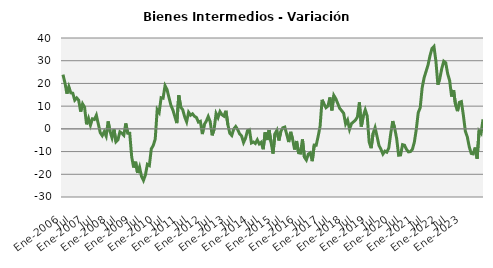
| Category | Series 0 |
|---|---|
| Ene-2006 | 23.876 |
|  | 20.262 |
|  | 15.496 |
|  | 18.543 |
|  | 15.843 |
|  | 15.687 |
| Jul | 12.647 |
|  | 13.608 |
|  | 12.61 |
|  | 7.587 |
|  | 11.007 |
|  | 9.539 |
| Ene-2007 | 1.998 |
|  | 4.625 |
|  | 1.6 |
|  | 4.423 |
|  | 4.114 |
|  | 5.987 |
| Jul | 2.127 |
|  | -1.716 |
|  | -2.993 |
|  | -1.241 |
|  | -3.208 |
|  | 3.287 |
| Ene-2008 | -1.214 |
|  | -3.973 |
|  | -0.237 |
|  | -5.657 |
|  | -4.785 |
|  | -1.306 |
| Jul | -1.913 |
|  | -2.817 |
|  | 2.391 |
|  | -1.894 |
|  | -1.914 |
|  | -12.244 |
| Ene-2009 | -17.023 |
|  | -14.473 |
|  | -19.395 |
|  | -16.783 |
|  | -20.936 |
|  | -22.696 |
| Jul | -20.305 |
|  | -15.607 |
|  | -16.138 |
|  | -8.785 |
|  | -7.311 |
|  | -4.49 |
| Ene-2010 | 8.487 |
|  | 7.203 |
|  | 13.719 |
|  | 13.508 |
|  | 18.996 |
|  | 17.331 |
| Jul | 13.784 |
|  | 10.33 |
|  | 8.314 |
|  | 5.424 |
|  | 2.526 |
|  | 14.757 |
| Ene-2011 | 9.529 |
|  | 8.453 |
|  | 5.3 |
|  | 3.102 |
|  | 7.298 |
|  | 6.015 |
| Jul | 6.614 |
|  | 5.527 |
|  | 5.012 |
|  | 2.973 |
|  | 3.344 |
|  | -2.304 |
| Ene-2012 | 1.951 |
|  | 3.361 |
|  | 5.434 |
|  | 3.146 |
|  | -2.85 |
|  | -0.16 |
| Jul | 6.712 |
|  | 4.943 |
|  | 7.572 |
|  | 6.204 |
|  | 5.597 |
|  | 7.953 |
| Ene-2013 | 1.889 |
|  | -1.995 |
|  | -2.895 |
|  | -0.043 |
|  | 1.034 |
|  | -0.307 |
| Jul | -2.222 |
|  | -3.135 |
|  | -6.03 |
|  | -4.123 |
|  | -0.763 |
|  | -0.372 |
| Ene-2014 | -6.201 |
|  | -5.762 |
|  | -6.435 |
|  | -4.839 |
|  | -6.626 |
|  | -5.895 |
| Jul | -8.974 |
|  | -1.556 |
|  | -4.913 |
|  | -0.525 |
|  | -5.8 |
|  | -10.893 |
| Ene-2015 | -2.143 |
|  | -0.604 |
|  | -5.12 |
|  | -1.128 |
|  | 0.471 |
|  | 0.795 |
| Jul | -2.44 |
|  | -5.811 |
|  | -1.314 |
|  | -4.602 |
|  | -9.085 |
|  | -5.361 |
| Ene-2016 | -10.52 |
|  | -10.702 |
|  | -4.658 |
|  | -12.454 |
|  | -13.725 |
|  | -11.107 |
| Jul | -10.533 |
|  | -14.22 |
|  | -7.144 |
|  | -7.211 |
|  | -3.318 |
|  | 1.184 |
| Ene-2017 | 12.783 |
|  | 10.91 |
|  | 9.321 |
|  | 10.071 |
|  | 13.826 |
|  | 8.123 |
| Jul | 14.717 |
|  | 13.26 |
|  | 11.14 |
|  | 9.012 |
|  | 7.997 |
|  | 6.878 |
| Ene-2018 | 2.162 |
|  | 3.843 |
|  | -0.207 |
|  | 2.341 |
|  | 3.069 |
|  | 3.841 |
| Jul | 5.22 |
|  | 11.652 |
|  | 1.027 |
|  | 5.652 |
|  | 8.364 |
|  | 5.651 |
| Ene-2019 | -5.838 |
|  | -8.504 |
|  | -2.005 |
|  | 0.551 |
|  | -3.286 |
|  | -7.328 |
| Jul | -9.015 |
|  | -11.08 |
|  | -9.796 |
|  | -10.288 |
|  | -8.384 |
|  | -1.961 |
| Ene-2020 | 3.429 |
|  | 0.277 |
|  | -4.267 |
|  | -11.617 |
|  | -11.497 |
|  | -6.956 |
| Jul | -7.209 |
|  | -9.008 |
|  | -10.139 |
|  | -9.996 |
|  | -9.053 |
|  | -5.906 |
| Ene-2021 | -0.268 |
|  | 7.185 |
|  | 9.294 |
|  | 18.149 |
|  | 22.53 |
|  | 25.337 |
| Jul | 28.164 |
|  | 32.231 |
|  | 35.392 |
|  | 36.28 |
|  | 29.809 |
|  | 19.447 |
| Ene-2022 | 22.256 |
|  | 26.615 |
|  | 29.759 |
|  | 29.076 |
|  | 24.243 |
|  | 21.227 |
| Jul | 14.224 |
|  | 17.072 |
|  | 10.546 |
|  | 7.797 |
|  | 11.702 |
|  | 12.003 |
| Ene-2023 | 5.896 |